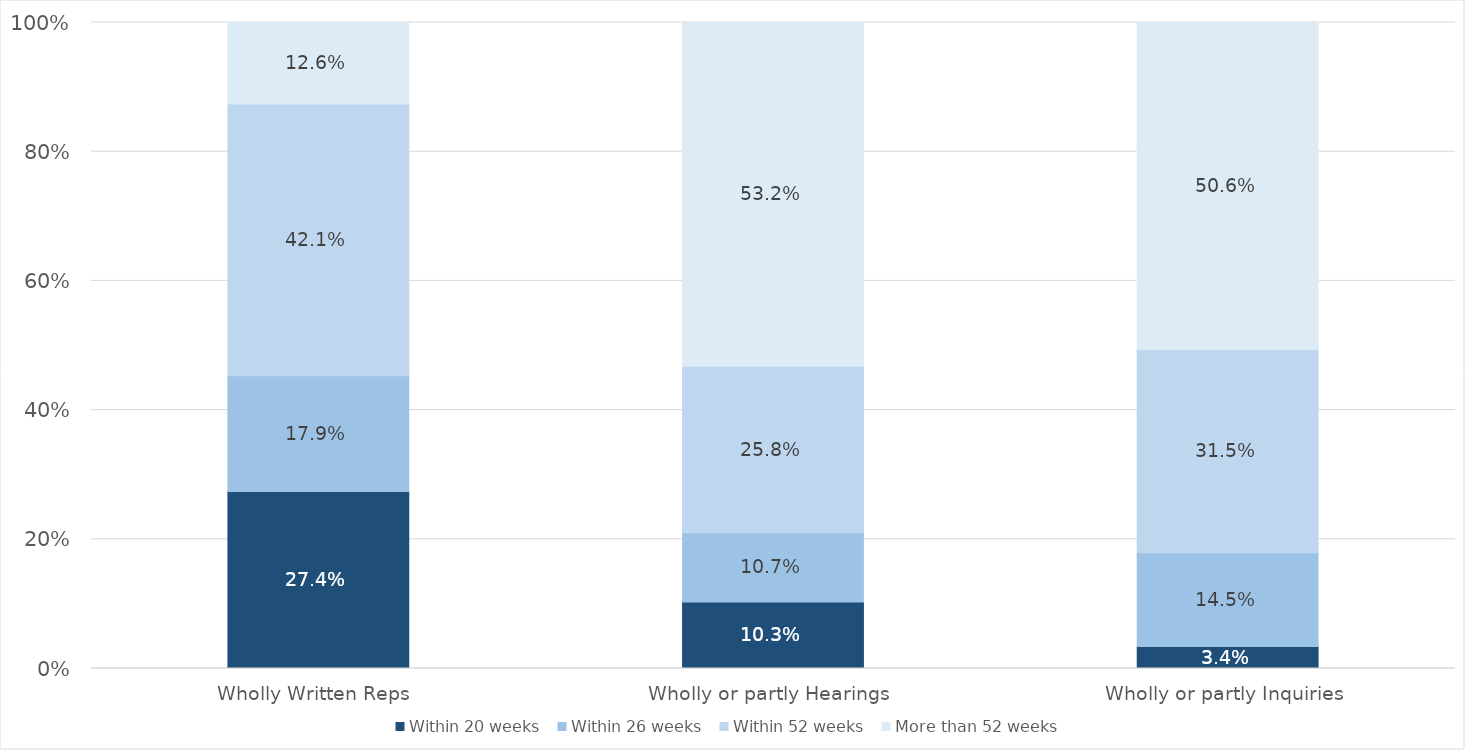
| Category | Within 20 weeks  | Within 26 weeks  | Within 52 weeks  | More than 52 weeks  |
|---|---|---|---|---|
| Wholly Written Reps  | 0.274 | 0.179 | 0.421 | 0.126 |
| Wholly or partly Hearings  | 0.103 | 0.107 | 0.258 | 0.532 |
| Wholly or partly Inquiries  | 0.034 | 0.145 | 0.315 | 0.506 |